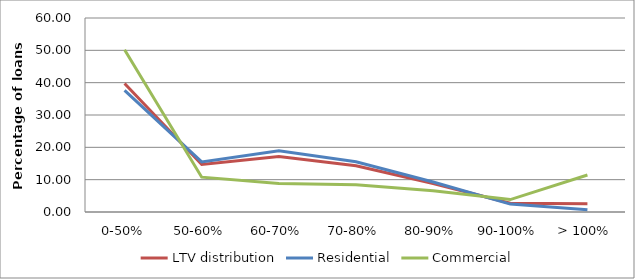
| Category | LTV distribution | Residential | Commercial |
|---|---|---|---|
| 0-50% | 39.755 | 37.591 | 50.171 |
| 50-60% | 14.678 | 15.489 | 10.773 |
| 60-70% | 17.197 | 18.941 | 8.803 |
| 70-80% | 14.296 | 15.522 | 8.394 |
| 80-90% | 8.822 | 9.293 | 6.556 |
| 90-100% | 2.693 | 2.453 | 3.846 |
| > 100% | 2.56 | 0.711 | 11.458 |